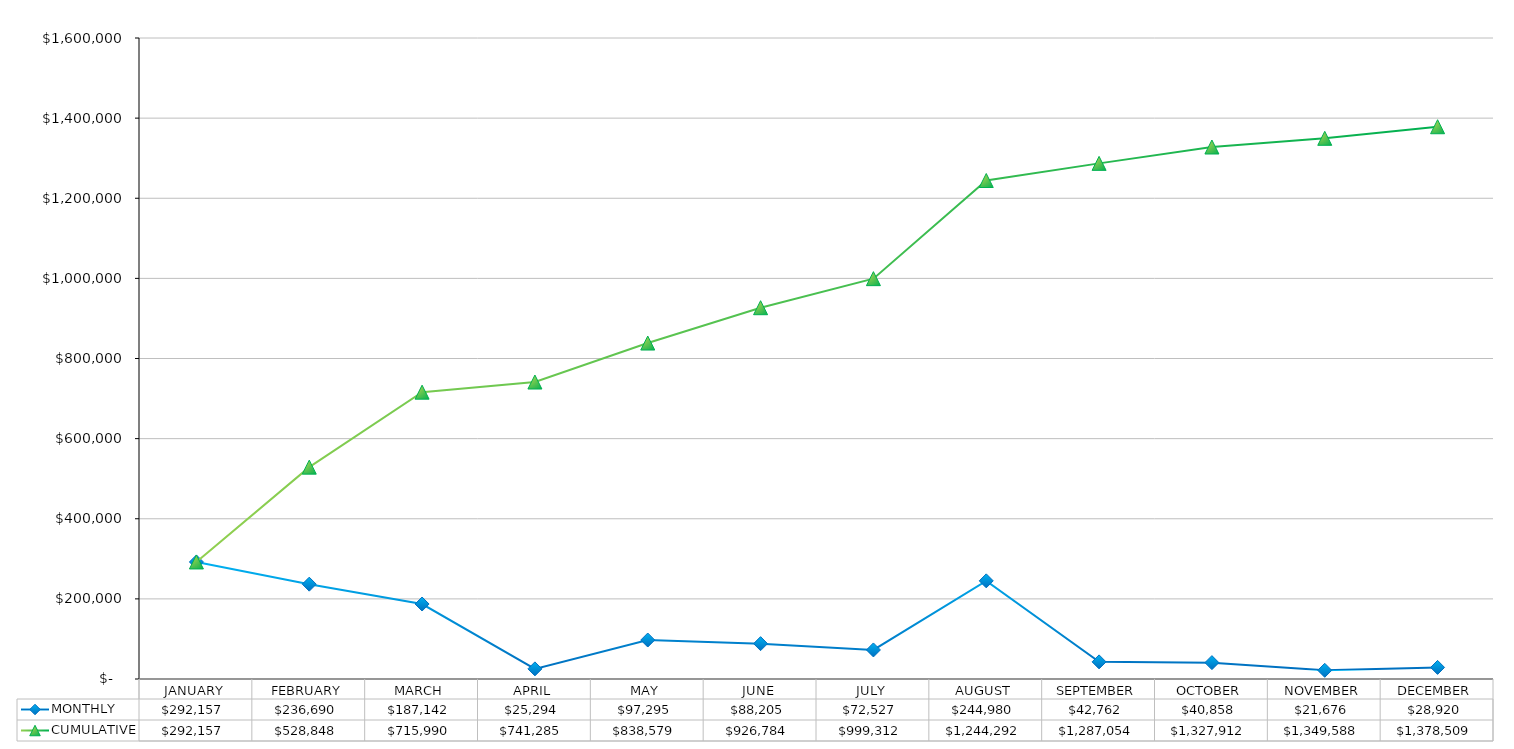
| Category | MONTHLY | CUMULATIVE |
|---|---|---|
| JANUARY | 292157.36 | 292157.36 |
| FEBRUARY | 236690.36 | 528847.72 |
| MARCH | 187142.35 | 715990.07 |
| APRIL | 25294.48 | 741284.55 |
| MAY | 97294.85 | 838579.4 |
| JUNE | 88205.04 | 926784.44 |
| JULY | 72527.24 | 999311.68 |
| AUGUST | 244980.16 | 1244291.84 |
| SEPTEMBER | 42761.94 | 1287053.78 |
| OCTOBER | 40858.37 | 1327912.15 |
| NOVEMBER | 21676.2 | 1349588.35 |
| DECEMBER | 28920.17 | 1378508.52 |